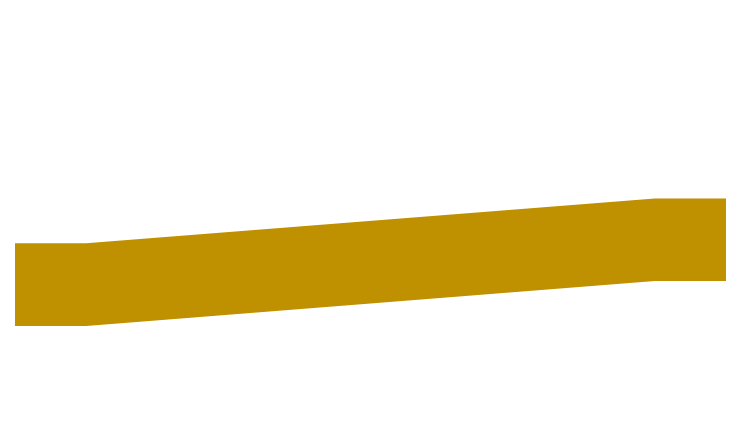
| Category | Series 0 | Series 1 | Series 2 |
|---|---|---|---|
| 0.0 | 2197.788 | 794.453 | 1020.919 |
| 10.0 | 2197.788 | 794.453 | 1020.919 |
| 90.0 | 1766.193 | 794.453 | 1452.514 |
| 100.0 | 1766.193 | 794.453 | 1452.514 |